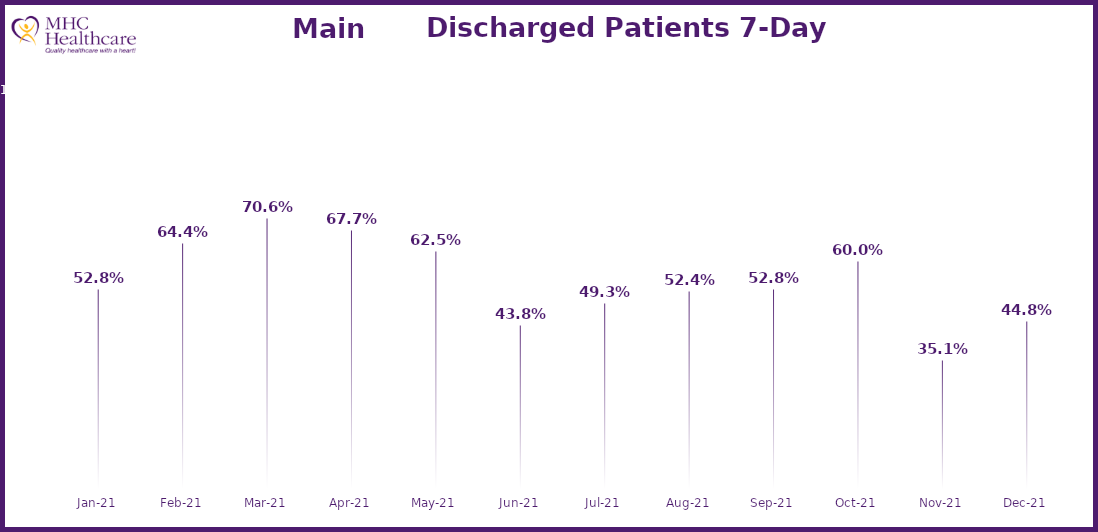
| Category | Online Access to Health Information |
|---|---|
| 2021-01-21 | 0.528 |
| 2021-02-01 | 0.644 |
| 2021-03-01 | 0.706 |
| 2021-04-01 | 0.677 |
| 2021-05-01 | 0.625 |
| 2021-06-01 | 0.438 |
| 2021-07-01 | 0.493 |
| 2021-08-01 | 0.524 |
| 2021-09-01 | 0.528 |
| 2021-10-01 | 0.6 |
| 2021-11-01 | 0.351 |
| 2021-12-01 | 0.448 |